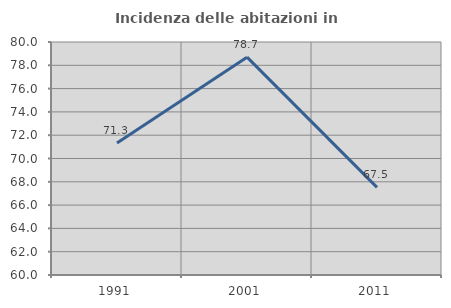
| Category | Incidenza delle abitazioni in proprietà  |
|---|---|
| 1991.0 | 71.336 |
| 2001.0 | 78.7 |
| 2011.0 | 67.517 |